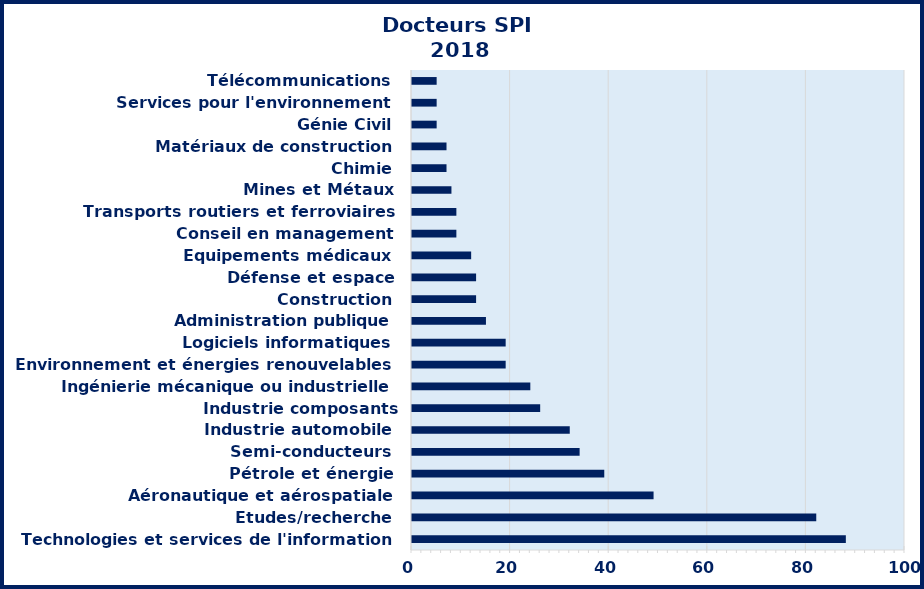
| Category | Series 0 |
|---|---|
| Technologies et services de l'information | 88 |
| Etudes/recherche | 82 |
| Aéronautique et aérospatiale | 49 |
| Pétrole et énergie | 39 |
| Semi-conducteurs | 34 |
| Industrie automobile | 32 |
| Industrie composants électriques/électroniques | 26 |
| Ingénierie mécanique ou industrielle | 24 |
| Environnement et énergies renouvelables | 19 |
| Logiciels informatiques | 19 |
| Administration publique | 15 |
| Construction | 13 |
| Défense et espace | 13 |
| Equipements médicaux | 12 |
| Conseil en management | 9 |
| Transports routiers et ferroviaires | 9 |
| Mines et Métaux | 8 |
| Chimie | 7 |
| Matériaux de construction | 7 |
| Génie Civil | 5 |
| Services pour l'environnement | 5 |
| Télécommunications | 5 |